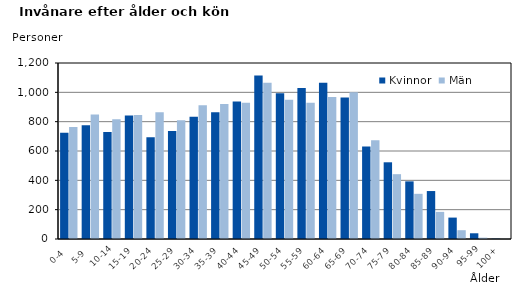
| Category | Kvinnor | Män |
|---|---|---|
|   0-4  | 725 | 763 |
|   5-9  | 776 | 849 |
| 10-14 | 729 | 816 |
| 15-19  | 842 | 845 |
| 20-24  | 693 | 864 |
| 25-29  | 736 | 810 |
| 30-34  | 833 | 912 |
| 35-39  | 865 | 921 |
| 40-44  | 937 | 929 |
| 45-49  | 1114 | 1066 |
| 50-54  | 994 | 949 |
| 55-59  | 1029 | 929 |
| 60-64  | 1066 | 969 |
| 65-69  | 964 | 1001 |
| 70-74  | 631 | 674 |
| 75-79  | 523 | 442 |
| 80-84  | 393 | 308 |
| 85-89  | 327 | 185 |
| 90-94  | 146 | 60 |
| 95-99 | 39 | 9 |
| 100+ | 2 | 1 |